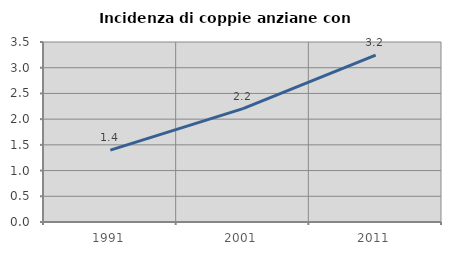
| Category | Incidenza di coppie anziane con figli |
|---|---|
| 1991.0 | 1.398 |
| 2001.0 | 2.205 |
| 2011.0 | 3.244 |